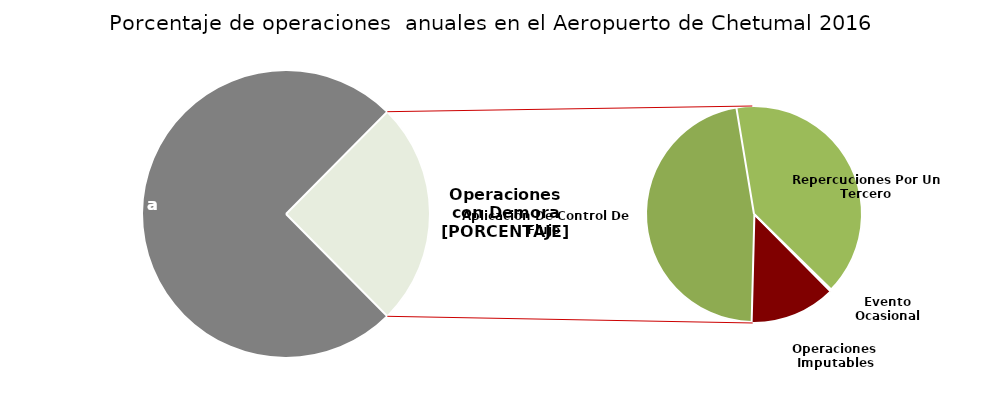
| Category | Series 0 |
|---|---|
| Operaciones a Tiempo | 1229 |
| Operaciones Imputables | 53 |
| Aplicación De Control De Flujo  | 194 |
| Repercuciones Por Un Tercero | 165 |
| Evento Ocasional | 1 |